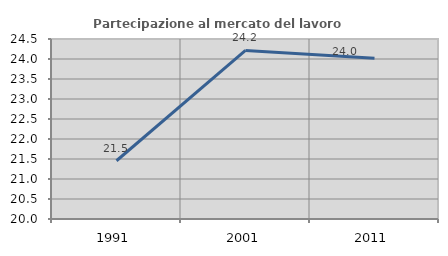
| Category | Partecipazione al mercato del lavoro  femminile |
|---|---|
| 1991.0 | 21.456 |
| 2001.0 | 24.213 |
| 2011.0 | 24.02 |